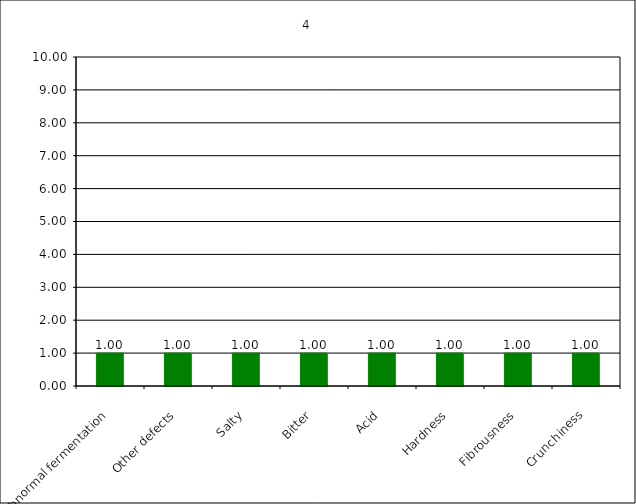
| Category | 4 |
|---|---|
| Abnormal fermentation | 1 |
| Other defects | 1 |
| Salty | 1 |
| Bitter | 1 |
| Acid | 1 |
| Hardness | 1 |
| Fibrousness | 1 |
| Crunchiness | 1 |